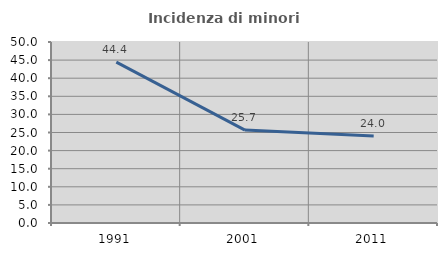
| Category | Incidenza di minori stranieri |
|---|---|
| 1991.0 | 44.444 |
| 2001.0 | 25.658 |
| 2011.0 | 24.044 |